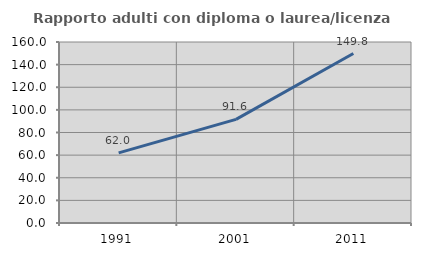
| Category | Rapporto adulti con diploma o laurea/licenza media  |
|---|---|
| 1991.0 | 61.995 |
| 2001.0 | 91.59 |
| 2011.0 | 149.776 |